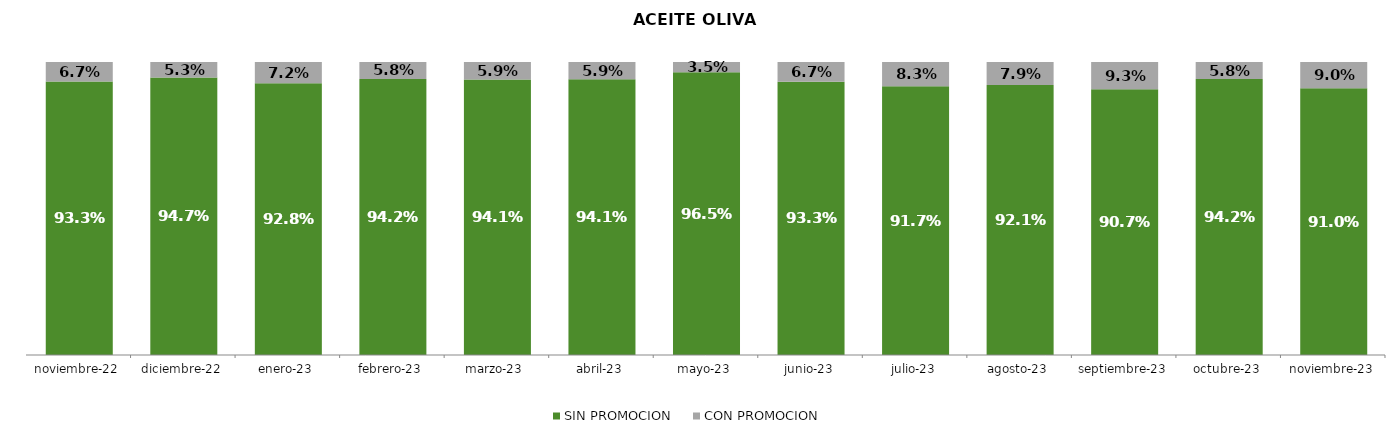
| Category | SIN PROMOCION   | CON PROMOCION   |
|---|---|---|
| 2022-11-01 | 0.933 | 0.067 |
| 2022-12-01 | 0.947 | 0.053 |
| 2023-01-01 | 0.928 | 0.072 |
| 2023-02-01 | 0.942 | 0.058 |
| 2023-03-01 | 0.941 | 0.059 |
| 2023-04-01 | 0.941 | 0.059 |
| 2023-05-01 | 0.965 | 0.035 |
| 2023-06-01 | 0.933 | 0.067 |
| 2023-07-01 | 0.917 | 0.083 |
| 2023-08-01 | 0.921 | 0.079 |
| 2023-09-01 | 0.907 | 0.093 |
| 2023-10-01 | 0.942 | 0.058 |
| 2023-11-01 | 0.91 | 0.09 |